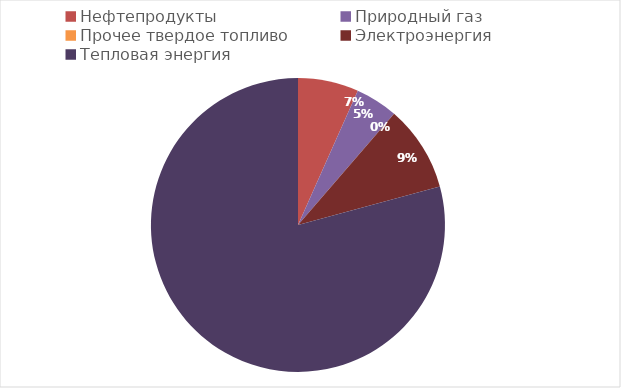
| Category | Series 0 |
|---|---|
| Нефтепродукты | 6170.251 |
| Природный газ | 4313.652 |
| Прочее твердое топливо | 3.511 |
| Электроэнергия | 8729.888 |
| Тепловая энергия | 73270.202 |